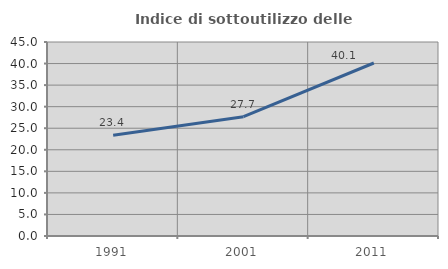
| Category | Indice di sottoutilizzo delle abitazioni  |
|---|---|
| 1991.0 | 23.37 |
| 2001.0 | 27.684 |
| 2011.0 | 40.132 |